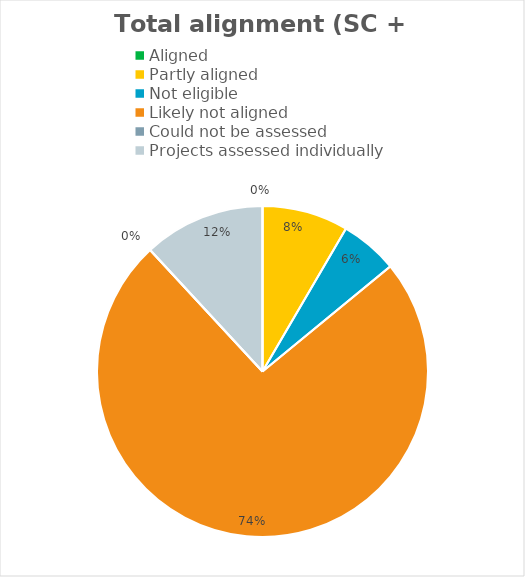
| Category | Series 0 |
|---|---|
| Aligned | 0 |
| Partly aligned | 0.084 |
| Not eligible  | 0.056 |
| Likely not aligned | 0.741 |
| Could not be assessed  | 0 |
| Projects assessed individually  | 0.119 |